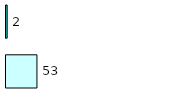
| Category | Series 0 | Series 1 |
|---|---|---|
| 0 | 53 | 2 |